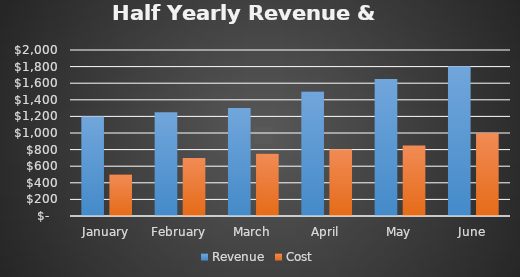
| Category | Revenue | Cost |
|---|---|---|
| January | 1200 | 500 |
| February | 1250 | 700 |
| March | 1300 | 750 |
| April | 1500 | 800 |
| May | 1650 | 850 |
| June | 1800 | 1000 |